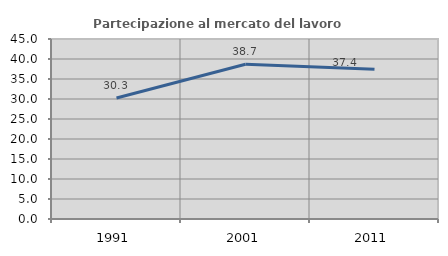
| Category | Partecipazione al mercato del lavoro  femminile |
|---|---|
| 1991.0 | 30.254 |
| 2001.0 | 38.678 |
| 2011.0 | 37.433 |